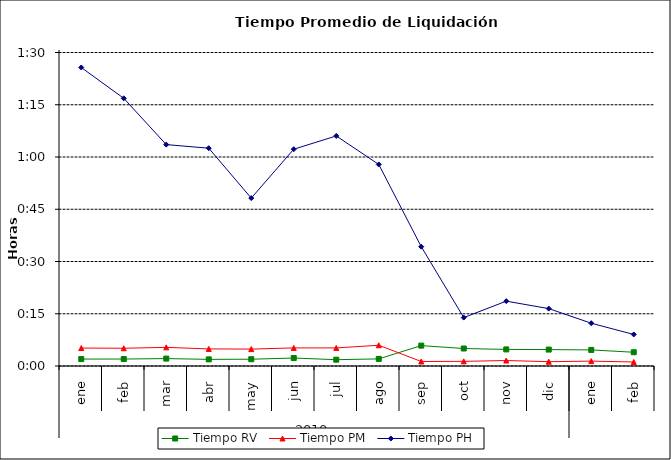
| Category | Tiempo RV | Tiempo PM | Tiempo PH |
|---|---|---|---|
| 0 | 0.001 | 0.004 | 0.06 |
| 1 | 0.001 | 0.004 | 0.053 |
| 2 | 0.001 | 0.004 | 0.044 |
| 3 | 0.001 | 0.003 | 0.043 |
| 4 | 0.001 | 0.003 | 0.033 |
| 5 | 0.002 | 0.004 | 0.043 |
| 6 | 0.001 | 0.004 | 0.046 |
| 7 | 0.001 | 0.004 | 0.04 |
| 8 | 0.004 | 0.001 | 0.024 |
| 9 | 0.003 | 0.001 | 0.01 |
| 10 | 0.003 | 0.001 | 0.013 |
| 11 | 0.003 | 0.001 | 0.011 |
| 12 | 0.003 | 0.001 | 0.009 |
| 13 | 0.003 | 0.001 | 0.006 |